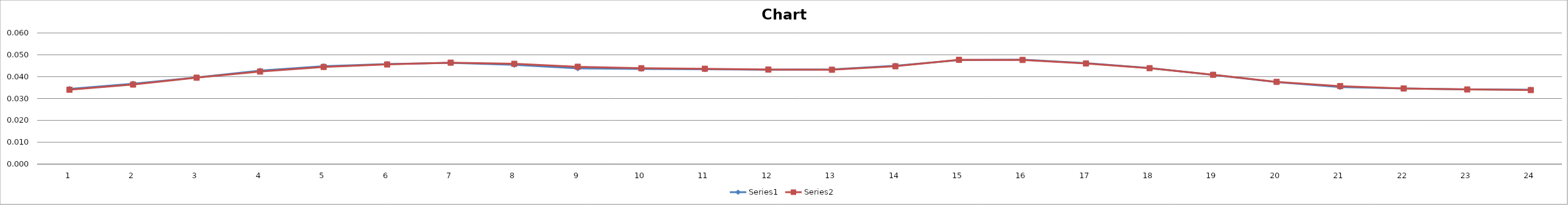
| Category | Series 0 | Series 1 |
|---|---|---|
| 0 | 0.034 | 0.034 |
| 1 | 0.037 | 0.036 |
| 2 | 0.04 | 0.04 |
| 3 | 0.043 | 0.042 |
| 4 | 0.045 | 0.044 |
| 5 | 0.046 | 0.046 |
| 6 | 0.046 | 0.046 |
| 7 | 0.045 | 0.046 |
| 8 | 0.044 | 0.045 |
| 9 | 0.044 | 0.044 |
| 10 | 0.043 | 0.044 |
| 11 | 0.043 | 0.043 |
| 12 | 0.043 | 0.043 |
| 13 | 0.045 | 0.045 |
| 14 | 0.048 | 0.048 |
| 15 | 0.048 | 0.048 |
| 16 | 0.046 | 0.046 |
| 17 | 0.044 | 0.044 |
| 18 | 0.041 | 0.041 |
| 19 | 0.037 | 0.038 |
| 20 | 0.035 | 0.036 |
| 21 | 0.035 | 0.035 |
| 22 | 0.034 | 0.034 |
| 23 | 0.034 | 0.034 |